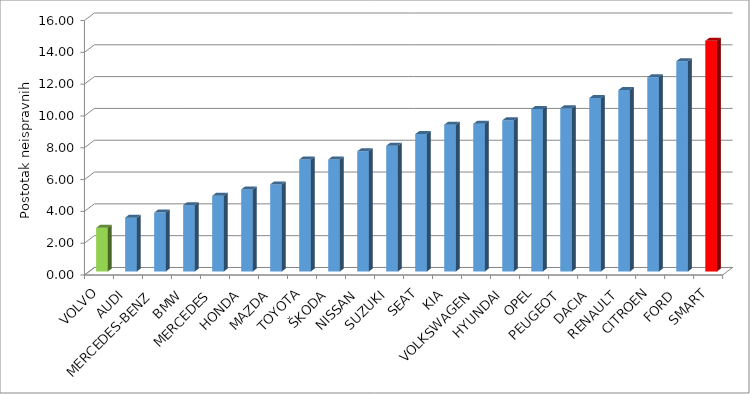
| Category | Series 4 |
|---|---|
| VOLVO | 2.749 |
| AUDI | 3.387 |
| MERCEDES-BENZ | 3.702 |
| BMW | 4.172 |
| MERCEDES | 4.756 |
| HONDA | 5.161 |
| MAZDA | 5.476 |
| TOYOTA | 7.044 |
| ŠKODA | 7.044 |
| NISSAN | 7.553 |
| SUZUKI | 7.908 |
| SEAT | 8.638 |
| KIA | 9.231 |
| VOLKSWAGEN | 9.283 |
| HYUNDAI | 9.502 |
| OPEL | 10.215 |
| PEUGEOT | 10.266 |
| DACIA | 10.905 |
| RENAULT | 11.404 |
| CITROEN | 12.205 |
| FORD | 13.223 |
| SMART | 14.5 |